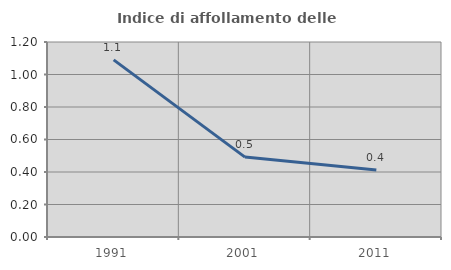
| Category | Indice di affollamento delle abitazioni  |
|---|---|
| 1991.0 | 1.09 |
| 2001.0 | 0.492 |
| 2011.0 | 0.413 |